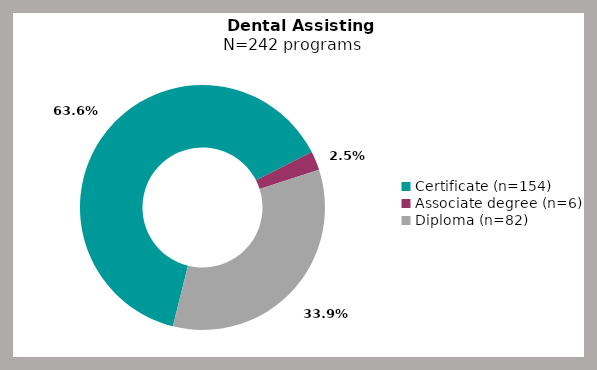
| Category | Series 0 |
|---|---|
| Certificate (n=154) | 0.636 |
| Associate degree (n=6) | 0.025 |
| Diploma (n=82) | 0.339 |